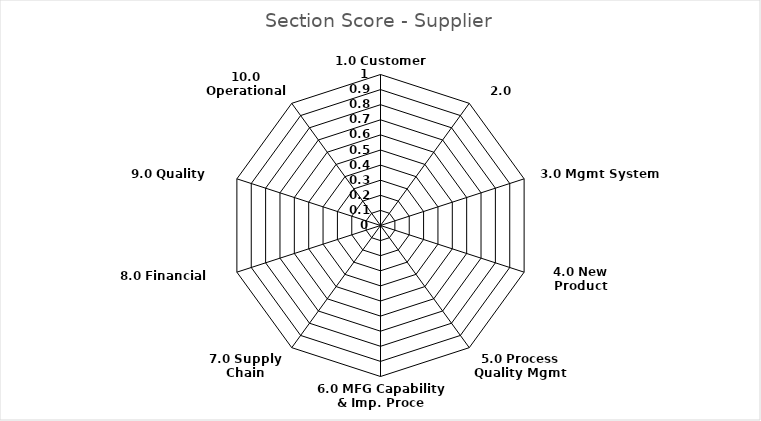
| Category | Section Score - Supplier |
|---|---|
| 1.0 Customer Service | 0 |
| 2.0 Results | 0 |
| 3.0 Mgmt System Plan | 0 |
| 4.0 New Product Support | 0 |
| 5.0 Process Quality Mgmt | 0 |
| 6.0 MFG Capability & Imp. Proce | 0 |
| 7.0 Supply Chain Management | 0 |
| 8.0 Financial Systems | 0 |
| 9.0 Quality Systems | 0 |
| 10.0 Operational Excellence | 0 |